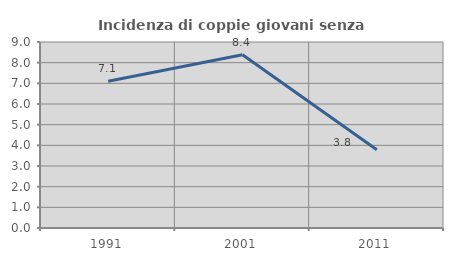
| Category | Incidenza di coppie giovani senza figli |
|---|---|
| 1991.0 | 7.104 |
| 2001.0 | 8.38 |
| 2011.0 | 3.784 |